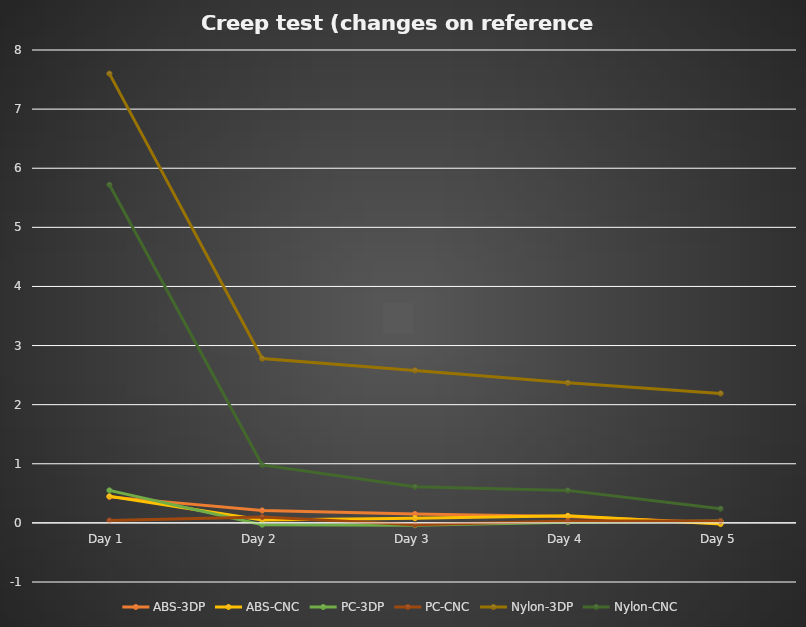
| Category | ABS-3DP | ABS-CNC | PC-3DP | PC-CNC | Nylon-3DP | Nylon-CNC |
|---|---|---|---|---|---|---|
| Day 1 | 0.44 | 0.45 | 0.55 | 0.04 | 7.6 | 5.72 |
| Day 2 | 0.21 | 0.05 | -0.03 | 0.1 | 2.78 | 0.98 |
| Day 3 | 0.15 | 0.08 | -0.04 | -0.03 | 2.58 | 0.61 |
| Day 4 | 0.11 | 0.12 | 0.01 | 0.03 | 2.37 | 0.55 |
| Day 5 | 0 | -0.02 | 0.03 | 0.03 | 2.19 | 0.24 |